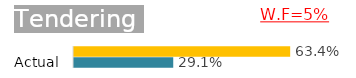
| Category | Tendering |
|---|---|
| Actual | 0.291 |
| Planed | 0.634 |